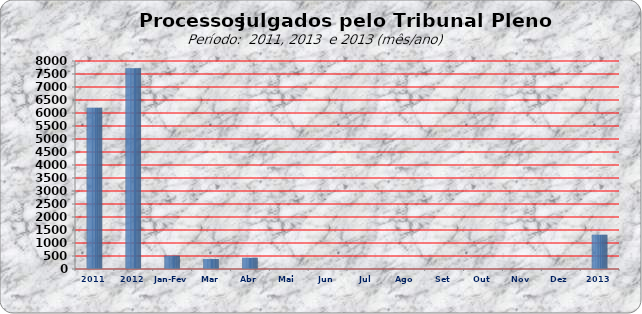
| Category | 6205 7722 509 381 429 0 0 0 0 0 0 0 0 |
|---|---|
| 2011 | 6205 |
| 2012 | 7722 |
| Jan-Fev | 509 |
| Mar | 381 |
| Abr | 429 |
| Mai | 0 |
| Jun | 0 |
| Jul | 0 |
| Ago | 0 |
| Set | 0 |
| Out | 0 |
| Nov | 0 |
| Dez | 0 |
| 2013 | 1319 |